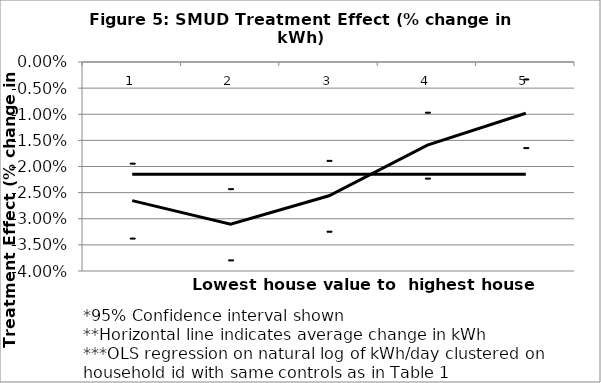
| Category | Series 0 | 2 SD below | 2 SD above | Average Reduction |
|---|---|---|---|---|
| 0 | -0.027 | -0.034 | -0.019 | -0.021 |
| 1 | -0.031 | -0.038 | -0.024 | -0.021 |
| 2 | -0.026 | -0.032 | -0.019 | -0.021 |
| 3 | -0.016 | -0.022 | -0.01 | -0.021 |
| 4 | -0.01 | -0.016 | -0.003 | -0.021 |